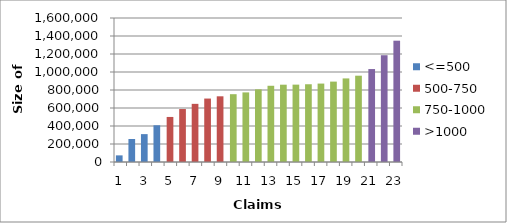
| Category | <=500 | 500-750 | 750-1000 | >1000 |
|---|---|---|---|---|
| 0 | 73677.5 | 0 | 0 | 0 |
| 1 | 255872.5 | 0 | 0 | 0 |
| 2 | 309790 | 0 | 0 | 0 |
| 3 | 408070 | 0 | 0 | 0 |
| 4 | 0 | 500532.5 | 0 | 0 |
| 5 | 0 | 588575 | 0 | 0 |
| 6 | 0 | 646130 | 0 | 0 |
| 7 | 0 | 704957.5 | 0 | 0 |
| 8 | 0 | 729917.5 | 0 | 0 |
| 9 | 0 | 0 | 753460 | 0 |
| 10 | 0 | 0 | 773370 | 0 |
| 11 | 0 | 0 | 807430 | 0 |
| 12 | 0 | 0 | 847015 | 0 |
| 13 | 0 | 0 | 858975 | 0 |
| 14 | 0 | 0 | 859657.5 | 0 |
| 15 | 0 | 0 | 863850 | 0 |
| 16 | 0 | 0 | 871390 | 0 |
| 17 | 0 | 0 | 893262.5 | 0 |
| 18 | 0 | 0 | 928687.5 | 0 |
| 19 | 0 | 0 | 958912.5 | 0 |
| 20 | 0 | 0 | 0 | 1032752.5 |
| 21 | 0 | 0 | 0 | 1186445 |
| 22 | 0 | 0 | 0 | 1347872.5 |